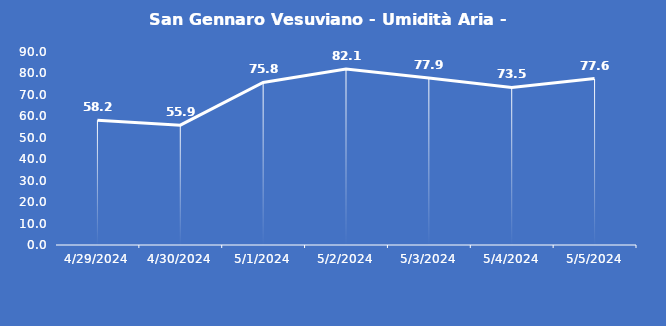
| Category | San Gennaro Vesuviano - Umidità Aria - Grezzo (%) |
|---|---|
| 4/29/24 | 58.2 |
| 4/30/24 | 55.9 |
| 5/1/24 | 75.8 |
| 5/2/24 | 82.1 |
| 5/3/24 | 77.9 |
| 5/4/24 | 73.5 |
| 5/5/24 | 77.6 |